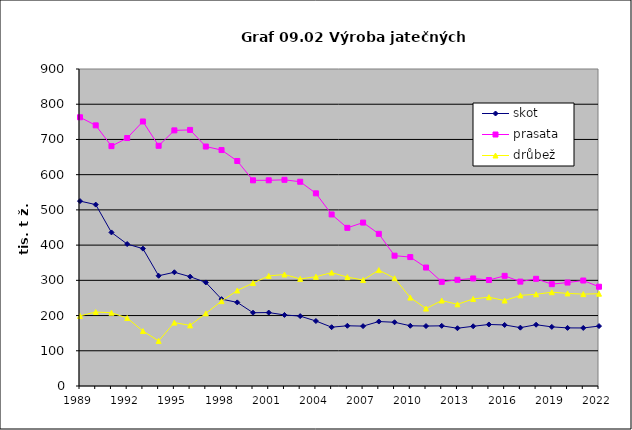
| Category | skot | prasata | drůbež |
|---|---|---|---|
| 1989.0 | 525 | 763 | 199 |
| 1990.0 | 515 | 740 | 210 |
| 1991.0 | 436 | 681 | 208 |
| 1992.0 | 403 | 704 | 193 |
| 1993.0 | 390 | 751 | 156 |
| 1994.0 | 313 | 682 | 128 |
| 1995.0 | 322.88 | 725.786 | 179.954 |
| 1996.0 | 310.426 | 727 | 172.064 |
| 1997.0 | 294 | 679.878 | 206.145 |
| 1998.0 | 246.585 | 669.905 | 240.887 |
| 1999.0 | 237.378 | 638.814 | 271.162 |
| 2000.0 | 208.04 | 583.929 | 292.289 |
| 2001.0 | 208.524 | 584.004 | 312.484 |
| 2002.0 | 201.744 | 585.374 | 316.582 |
| 2003.0 | 198.417 | 579.868 | 303.979 |
| 2004.0 | 184.531 | 547.009 | 310.225 |
| 2005.0 | 167 | 487 | 322 |
| 2006.0 | 171 | 449 | 309 |
| 2007.0 | 170 | 464 | 301 |
| 2008.0 | 183 | 432 | 329 |
| 2009.0 | 180.912 | 370 | 306 |
| 2010.0 | 171 | 366 | 251 |
| 2011.0 | 170.253 | 336.258 | 219.789 |
| 2012.0 | 170.83 | 295.791 | 242.568 |
| 2013.0 | 164.043 | 301.542 | 231.898 |
| 2014.0 | 169.588 | 305.306 | 247.215 |
| 2015.0 | 174.694 | 300.883 | 252.081 |
| 2016.0 | 173.342 | 312.739 | 242.624 |
| 2017.0 | 165.65 | 296.375 | 257.263 |
| 2018.0 | 173.982 | 304.356 | 260.375 |
| 2019.0 | 167.902 | 289.164 | 266.343 |
| 2020.0 | 164.974 | 293.682 | 262.867 |
| 2021.0 | 164.759 | 299.445 | 260.835 |
| 2022.0 | 170.164 | 281.867 | 262.03 |